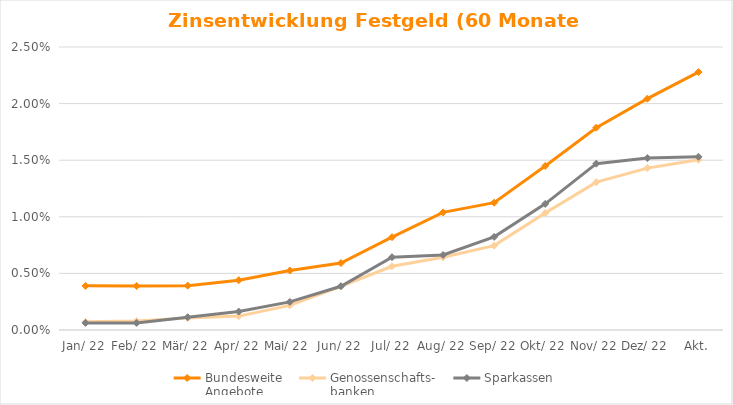
| Category | Bundesweite
Angebote | Genossenschafts-
banken | Sparkassen |
|---|---|---|---|
| Jan. 22 | 0.004 | 0.001 | 0.001 |
| Feb. 22 | 0.004 | 0.001 | 0.001 |
| Mrz. 22 | 0.004 | 0.001 | 0.001 |
| Apr. 22 | 0.004 | 0.001 | 0.002 |
| Mai. 22 | 0.005 | 0.002 | 0.002 |
| Jun. 22 | 0.006 | 0.004 | 0.004 |
| Jul. 22 | 0.008 | 0.006 | 0.006 |
| Aug. 22 | 0.01 | 0.006 | 0.007 |
| Sep. 22 | 0.011 | 0.007 | 0.008 |
| Okt. 22 | 0.014 | 0.01 | 0.011 |
| Nov. 22 | 0.018 | 0.013 | 0.015 |
| Dez. 22 | 0.02 | 0.014 | 0.015 |
| Akt. | 0.023 | 0.015 | 0.015 |